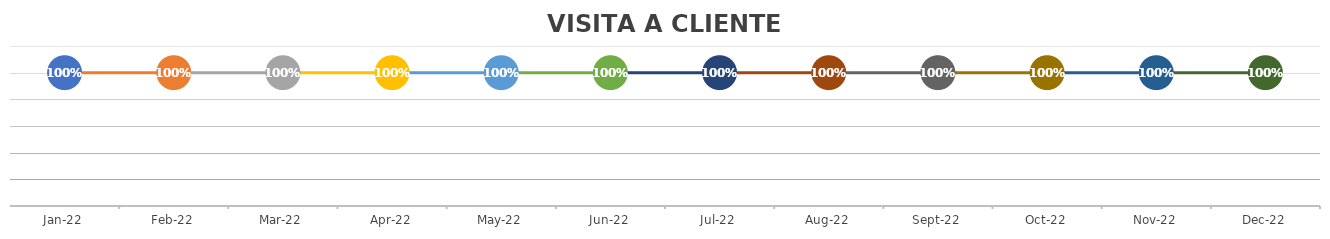
| Category | VISITA A CLIENTE POTENCIAL % |
|---|---|
| 2022-01-18 | 1 |
| 2022-02-18 | 1 |
| 2022-03-18 | 1 |
| 2022-04-18 | 1 |
| 2022-05-18 | 1 |
| 2022-06-18 | 1 |
| 2022-07-18 | 1 |
| 2022-08-18 | 1 |
| 2022-09-18 | 1 |
| 2022-10-18 | 1 |
| 2022-11-18 | 1 |
| 2022-12-18 | 1 |